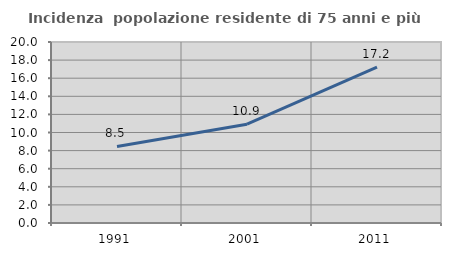
| Category | Incidenza  popolazione residente di 75 anni e più |
|---|---|
| 1991.0 | 8.453 |
| 2001.0 | 10.92 |
| 2011.0 | 17.217 |